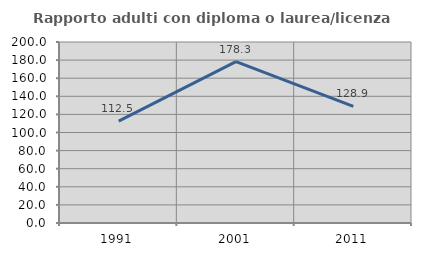
| Category | Rapporto adulti con diploma o laurea/licenza media  |
|---|---|
| 1991.0 | 112.5 |
| 2001.0 | 178.307 |
| 2011.0 | 128.947 |